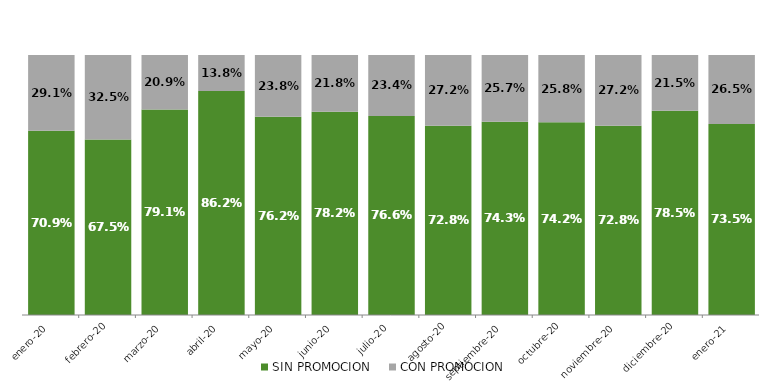
| Category | SIN PROMOCION   | CON PROMOCION   |
|---|---|---|
| 2020-01-01 | 0.709 | 0.291 |
| 2020-02-01 | 0.675 | 0.325 |
| 2020-03-01 | 0.791 | 0.209 |
| 2020-04-01 | 0.862 | 0.138 |
| 2020-05-01 | 0.762 | 0.238 |
| 2020-06-01 | 0.782 | 0.218 |
| 2020-07-01 | 0.766 | 0.234 |
| 2020-08-01 | 0.728 | 0.272 |
| 2020-09-01 | 0.743 | 0.257 |
| 2020-10-01 | 0.742 | 0.258 |
| 2020-11-01 | 0.728 | 0.272 |
| 2020-12-01 | 0.785 | 0.215 |
| 2021-01-01 | 0.735 | 0.265 |